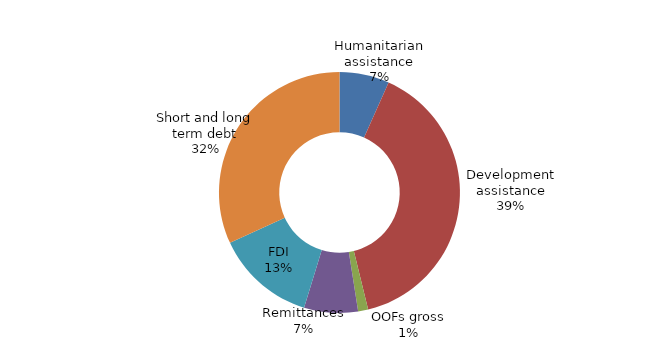
| Category | Series 0 |
|---|---|
| Humanitarian assistance | 0.484 |
| Development assistance | 2.863 |
| OOFs gross | 0.097 |
| Remittances | 0.524 |
| FDI | 0.97 |
| Short and long term debt | 2.309 |
| Portfolio equity | 0 |
| Peacekeeping | 0 |